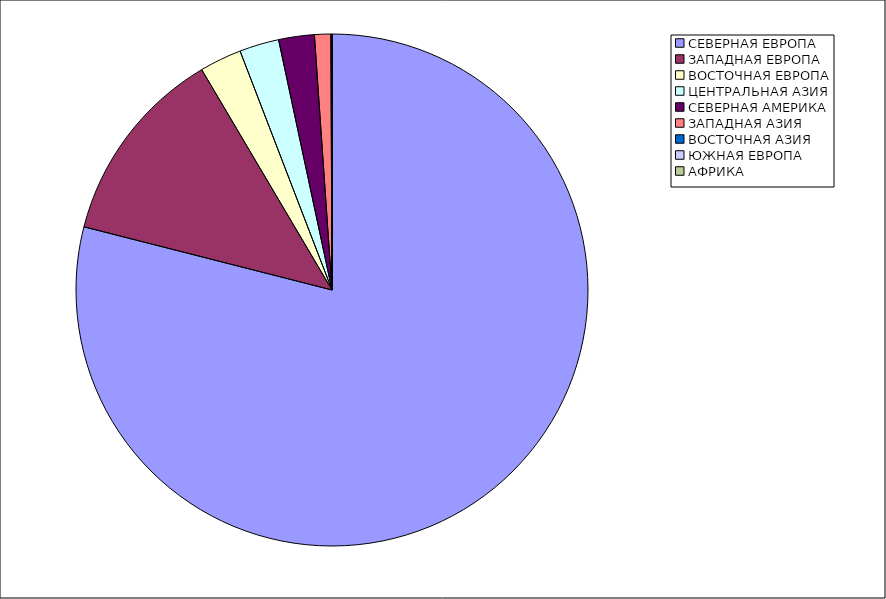
| Category | Оборот |
|---|---|
| СЕВЕРНАЯ ЕВРОПА | 78.97 |
| ЗАПАДНАЯ ЕВРОПА | 12.531 |
| ВОСТОЧНАЯ ЕВРОПА | 2.655 |
| ЦЕНТРАЛЬНАЯ АЗИЯ | 2.496 |
| СЕВЕРНАЯ АМЕРИКА | 2.252 |
| ЗАПАДНАЯ АЗИЯ | 1.027 |
| ВОСТОЧНАЯ АЗИЯ | 0.057 |
| ЮЖНАЯ ЕВРОПА | 0.011 |
| АФРИКА | 0.002 |